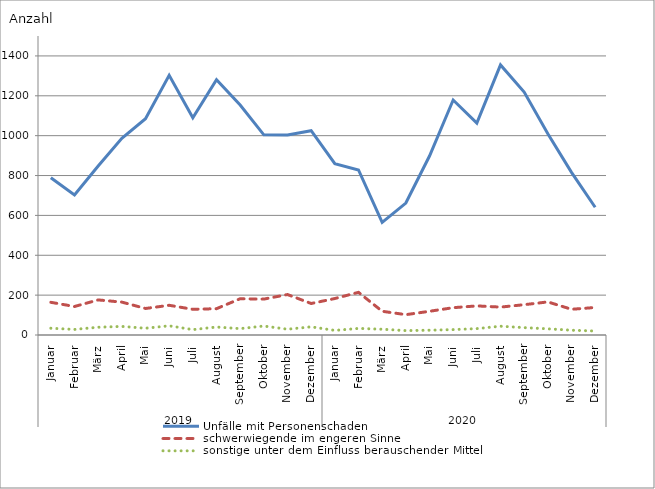
| Category | Unfälle mit Personenschaden | schwerwiegende im engeren Sinne | sonstige unter dem Einfluss berauschender Mittel |
|---|---|---|---|
| 0 | 789 | 164 | 34 |
| 1 | 702 | 143 | 28 |
| 2 | 848 | 176 | 39 |
| 3 | 987 | 165 | 43 |
| 4 | 1085 | 133 | 34 |
| 5 | 1303 | 149 | 46 |
| 6 | 1090 | 129 | 27 |
| 7 | 1281 | 132 | 40 |
| 8 | 1154 | 182 | 32 |
| 9 | 1004 | 180 | 45 |
| 10 | 1003 | 203 | 29 |
| 11 | 1025 | 158 | 41 |
| 12 | 860 | 183 | 23 |
| 13 | 828 | 214 | 33 |
| 14 | 565 | 119 | 29 |
| 15 | 662 | 102 | 22 |
| 16 | 898 | 119 | 24 |
| 17 | 1179 | 137 | 27 |
| 18 | 1063 | 146 | 32 |
| 19 | 1355 | 140 | 44 |
| 20 | 1219 | 152 | 37 |
| 21 | 1010 | 166 | 31 |
| 22 | 816 | 129 | 24 |
| 23 | 641 | 138 | 20 |